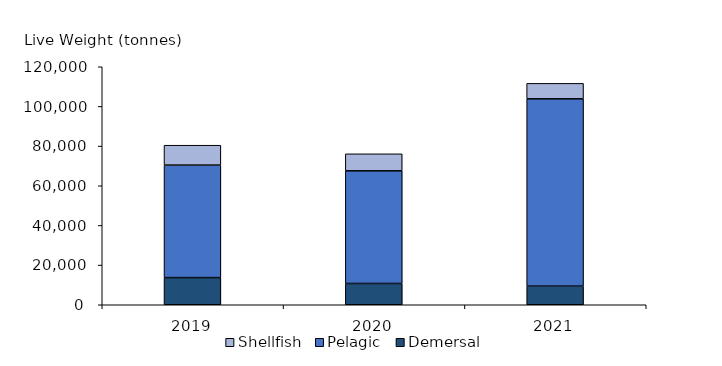
| Category | Demersal | Pelagic | Shellfish |
|---|---|---|---|
| 2019.0 | 13696.013 | 56723.259 | 10023.713 |
| 2020.0 | 10733.519 | 56798.727 | 8571.777 |
| 2021.0 | 9387.139 | 94452.072 | 7789.257 |